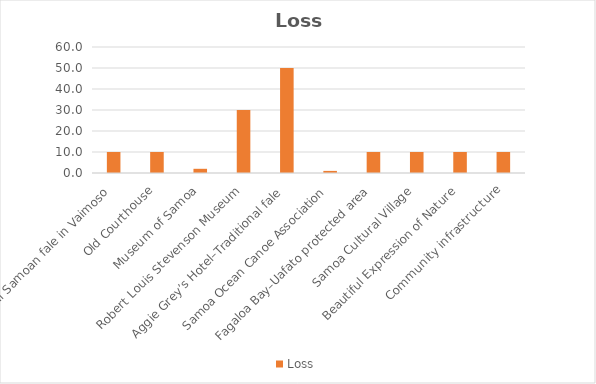
| Category | Loss |
|---|---|
| Traditional Samoan fale in Vaimoso | 10 |
| Old Courthouse | 10 |
| Museum of Samoa | 2 |
| Robert Louis Stevenson Museum | 30 |
| Aggie Grey’s Hotel–Traditional fale | 50 |
| Samoa Ocean Canoe Association | 1 |
| Fagaloa Bay–Uafato protected area | 10 |
| Samoa Cultural Village | 10 |
| Beautiful Expression of Nature | 10 |
| Community infrastructure | 10 |